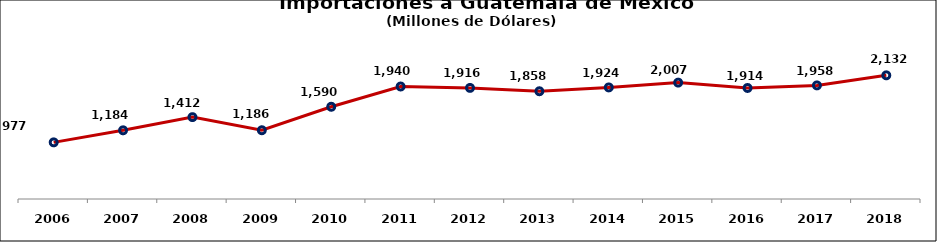
| Category | Series 0 |
|---|---|
| 2006 | 976.529 |
| 2007 | 1184.276 |
| 2008 | 1411.63 |
| 2009 | 1185.62 |
| 2010 | 1590.324 |
| 2011 | 1939.854 |
| 2012 | 1915.674 |
| 2013 | 1857.645 |
| 2014 | 1923.622 |
| 2015 | 2006.711 |
| 2016 | 1914.319 |
| 2017 | 1958.412 |
| 2018 | 2132.184 |